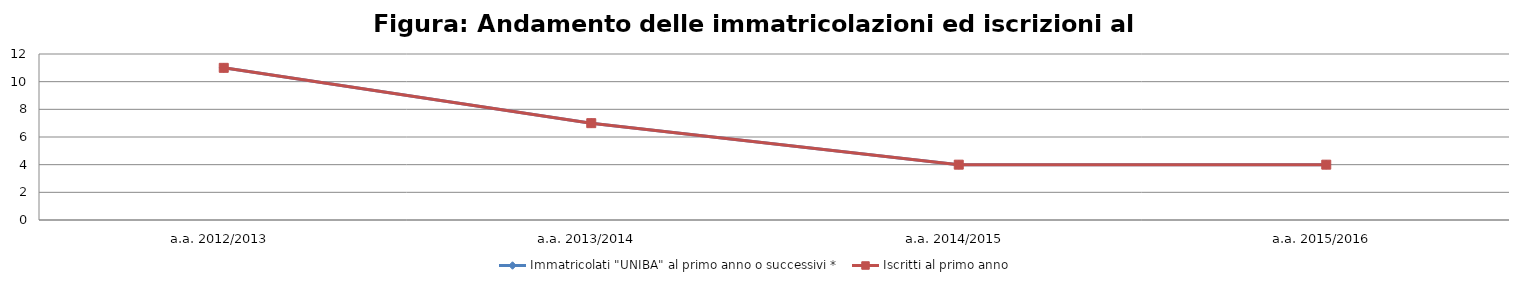
| Category | Immatricolati "UNIBA" al primo anno o successivi * | Iscritti al primo anno  |
|---|---|---|
| a.a. 2012/2013 | 11 | 11 |
| a.a. 2013/2014 | 7 | 7 |
| a.a. 2014/2015 | 4 | 4 |
| a.a. 2015/2016 | 4 | 4 |